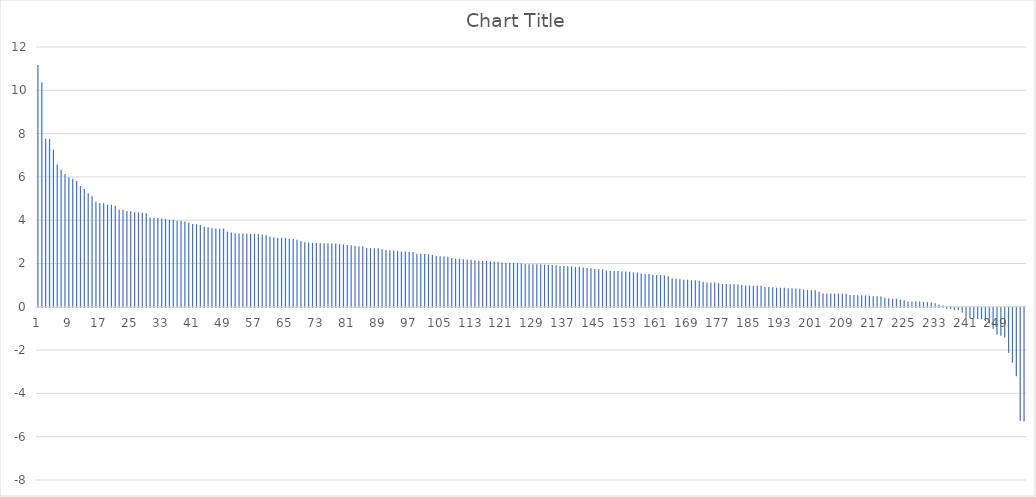
| Category | Series 0 |
|---|---|
| 0 | 11.17 |
| 1 | 10.37 |
| 2 | 7.76 |
| 3 | 7.75 |
| 4 | 7.26 |
| 5 | 6.57 |
| 6 | 6.34 |
| 7 | 6.13 |
| 8 | 5.98 |
| 9 | 5.91 |
| 10 | 5.81 |
| 11 | 5.58 |
| 12 | 5.44 |
| 13 | 5.24 |
| 14 | 5.11 |
| 15 | 4.85 |
| 16 | 4.79 |
| 17 | 4.78 |
| 18 | 4.72 |
| 19 | 4.71 |
| 20 | 4.67 |
| 21 | 4.48 |
| 22 | 4.48 |
| 23 | 4.42 |
| 24 | 4.41 |
| 25 | 4.37 |
| 26 | 4.37 |
| 27 | 4.34 |
| 28 | 4.32 |
| 29 | 4.12 |
| 30 | 4.11 |
| 31 | 4.1 |
| 32 | 4.08 |
| 33 | 4.06 |
| 34 | 4.02 |
| 35 | 4.02 |
| 36 | 3.98 |
| 37 | 3.98 |
| 38 | 3.94 |
| 39 | 3.88 |
| 40 | 3.82 |
| 41 | 3.81 |
| 42 | 3.78 |
| 43 | 3.7 |
| 44 | 3.68 |
| 45 | 3.63 |
| 46 | 3.62 |
| 47 | 3.61 |
| 48 | 3.61 |
| 49 | 3.47 |
| 50 | 3.43 |
| 51 | 3.4 |
| 52 | 3.38 |
| 53 | 3.38 |
| 54 | 3.37 |
| 55 | 3.37 |
| 56 | 3.37 |
| 57 | 3.36 |
| 58 | 3.34 |
| 59 | 3.31 |
| 60 | 3.24 |
| 61 | 3.2 |
| 62 | 3.19 |
| 63 | 3.19 |
| 64 | 3.17 |
| 65 | 3.14 |
| 66 | 3.13 |
| 67 | 3.1 |
| 68 | 3.04 |
| 69 | 2.98 |
| 70 | 2.97 |
| 71 | 2.95 |
| 72 | 2.95 |
| 73 | 2.94 |
| 74 | 2.93 |
| 75 | 2.93 |
| 76 | 2.92 |
| 77 | 2.92 |
| 78 | 2.89 |
| 79 | 2.88 |
| 80 | 2.85 |
| 81 | 2.84 |
| 82 | 2.81 |
| 83 | 2.8 |
| 84 | 2.79 |
| 85 | 2.72 |
| 86 | 2.71 |
| 87 | 2.71 |
| 88 | 2.71 |
| 89 | 2.66 |
| 90 | 2.62 |
| 91 | 2.61 |
| 92 | 2.6 |
| 93 | 2.58 |
| 94 | 2.55 |
| 95 | 2.55 |
| 96 | 2.54 |
| 97 | 2.53 |
| 98 | 2.45 |
| 99 | 2.45 |
| 100 | 2.44 |
| 101 | 2.42 |
| 102 | 2.39 |
| 103 | 2.35 |
| 104 | 2.34 |
| 105 | 2.32 |
| 106 | 2.31 |
| 107 | 2.25 |
| 108 | 2.22 |
| 109 | 2.22 |
| 110 | 2.2 |
| 111 | 2.19 |
| 112 | 2.17 |
| 113 | 2.15 |
| 114 | 2.13 |
| 115 | 2.12 |
| 116 | 2.12 |
| 117 | 2.1 |
| 118 | 2.09 |
| 119 | 2.08 |
| 120 | 2.05 |
| 121 | 2.03 |
| 122 | 2.03 |
| 123 | 2.03 |
| 124 | 2.01 |
| 125 | 2 |
| 126 | 1.98 |
| 127 | 1.97 |
| 128 | 1.97 |
| 129 | 1.97 |
| 130 | 1.96 |
| 131 | 1.95 |
| 132 | 1.94 |
| 133 | 1.93 |
| 134 | 1.92 |
| 135 | 1.89 |
| 136 | 1.88 |
| 137 | 1.87 |
| 138 | 1.87 |
| 139 | 1.85 |
| 140 | 1.85 |
| 141 | 1.81 |
| 142 | 1.79 |
| 143 | 1.78 |
| 144 | 1.75 |
| 145 | 1.73 |
| 146 | 1.73 |
| 147 | 1.68 |
| 148 | 1.65 |
| 149 | 1.65 |
| 150 | 1.65 |
| 151 | 1.63 |
| 152 | 1.63 |
| 153 | 1.62 |
| 154 | 1.59 |
| 155 | 1.59 |
| 156 | 1.54 |
| 157 | 1.52 |
| 158 | 1.52 |
| 159 | 1.48 |
| 160 | 1.47 |
| 161 | 1.46 |
| 162 | 1.45 |
| 163 | 1.41 |
| 164 | 1.32 |
| 165 | 1.31 |
| 166 | 1.28 |
| 167 | 1.25 |
| 168 | 1.25 |
| 169 | 1.23 |
| 170 | 1.23 |
| 171 | 1.2 |
| 172 | 1.16 |
| 173 | 1.12 |
| 174 | 1.12 |
| 175 | 1.12 |
| 176 | 1.09 |
| 177 | 1.05 |
| 178 | 1.05 |
| 179 | 1.04 |
| 180 | 1.04 |
| 181 | 1.03 |
| 182 | 1.01 |
| 183 | 0.98 |
| 184 | 0.98 |
| 185 | 0.97 |
| 186 | 0.97 |
| 187 | 0.97 |
| 188 | 0.92 |
| 189 | 0.92 |
| 190 | 0.9 |
| 191 | 0.88 |
| 192 | 0.88 |
| 193 | 0.88 |
| 194 | 0.86 |
| 195 | 0.86 |
| 196 | 0.84 |
| 197 | 0.83 |
| 198 | 0.8 |
| 199 | 0.78 |
| 200 | 0.77 |
| 201 | 0.77 |
| 202 | 0.7 |
| 203 | 0.61 |
| 204 | 0.61 |
| 205 | 0.61 |
| 206 | 0.61 |
| 207 | 0.61 |
| 208 | 0.61 |
| 209 | 0.6 |
| 210 | 0.55 |
| 211 | 0.54 |
| 212 | 0.53 |
| 213 | 0.53 |
| 214 | 0.52 |
| 215 | 0.51 |
| 216 | 0.49 |
| 217 | 0.49 |
| 218 | 0.48 |
| 219 | 0.42 |
| 220 | 0.38 |
| 221 | 0.37 |
| 222 | 0.37 |
| 223 | 0.33 |
| 224 | 0.3 |
| 225 | 0.25 |
| 226 | 0.25 |
| 227 | 0.25 |
| 228 | 0.24 |
| 229 | 0.22 |
| 230 | 0.21 |
| 231 | 0.2 |
| 232 | 0.16 |
| 233 | 0.11 |
| 234 | 0.06 |
| 235 | -0.06 |
| 236 | -0.07 |
| 237 | -0.1 |
| 238 | -0.1 |
| 239 | -0.22 |
| 240 | -0.46 |
| 241 | -0.49 |
| 242 | -0.5 |
| 243 | -0.52 |
| 244 | -0.53 |
| 245 | -0.61 |
| 246 | -0.73 |
| 247 | -0.97 |
| 248 | -1.23 |
| 249 | -1.29 |
| 250 | -1.37 |
| 251 | -2.08 |
| 252 | -2.54 |
| 253 | -3.16 |
| 254 | -5.22 |
| 255 | -5.25 |